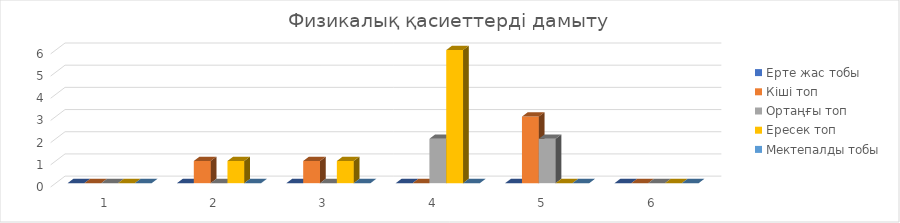
| Category | Ерте жас тобы  | Кіші топ | Ортаңғы топ | Ересек топ | Мектепалды тобы |
|---|---|---|---|---|---|
| 0 | 0 | 0 | 0 | 0 | 0 |
| 1 | 0 | 1 | 0 | 1 | 0 |
| 2 | 0 | 1 | 0 | 1 | 0 |
| 3 | 0 | 0 | 2 | 6 | 0 |
| 4 | 0 | 3 | 2 | 0 | 0 |
| 5 | 0 | 0 | 0 | 0 | 0 |